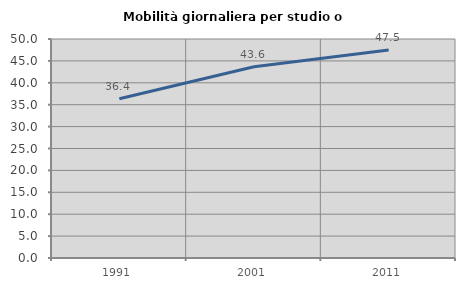
| Category | Mobilità giornaliera per studio o lavoro |
|---|---|
| 1991.0 | 36.371 |
| 2001.0 | 43.65 |
| 2011.0 | 47.493 |